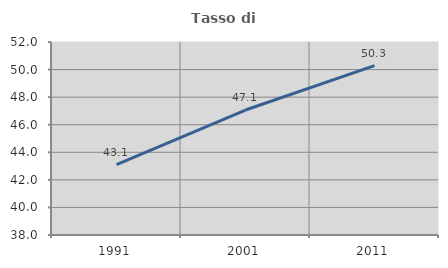
| Category | Tasso di occupazione   |
|---|---|
| 1991.0 | 43.1 |
| 2001.0 | 47.065 |
| 2011.0 | 50.292 |